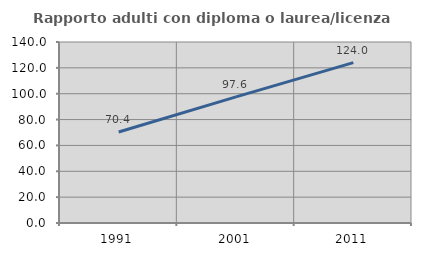
| Category | Rapporto adulti con diploma o laurea/licenza media  |
|---|---|
| 1991.0 | 70.362 |
| 2001.0 | 97.601 |
| 2011.0 | 124.048 |